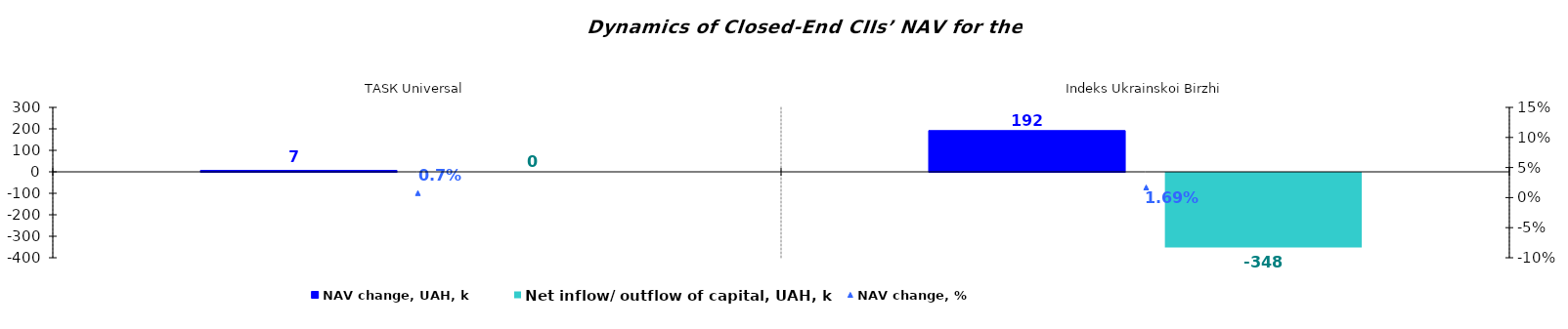
| Category | NAV change, UAH, k | Net inflow/ outflow of capital, UAH, k |
|---|---|---|
| ТАSК Universal | 6.645 | 0 |
| Іndeks Ukrainskoi Birzhi | 191.924 | -348.135 |